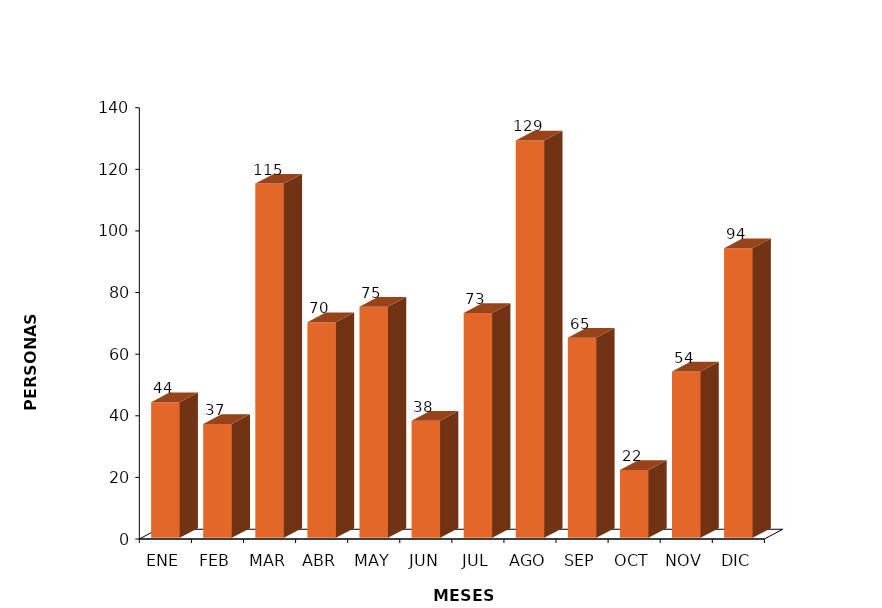
| Category | Series 0 |
|---|---|
| ENE | 44 |
| FEB | 37 |
| MAR | 115 |
| ABR | 70 |
| MAY | 75 |
| JUN | 38 |
| JUL | 73 |
| AGO | 129 |
| SEP | 65 |
| OCT | 22 |
| NOV | 54 |
| DIC | 94 |